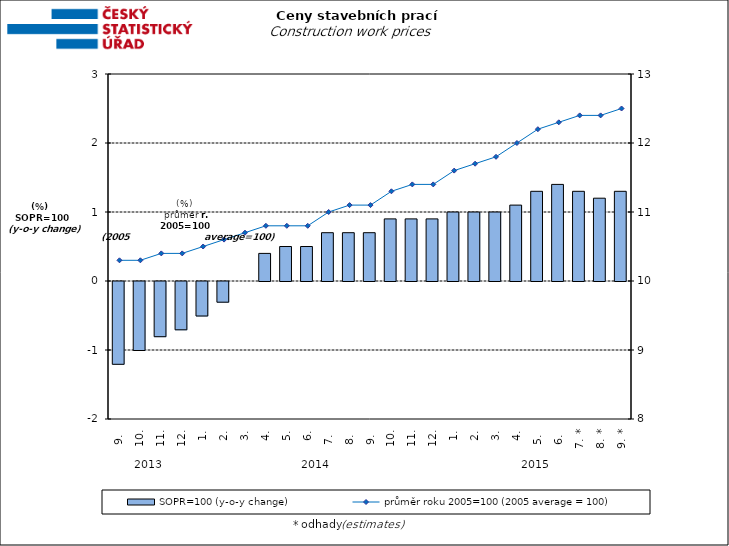
| Category | SOPR=100 (y-o-y change)   |
|---|---|
| 0 | -1.2 |
| 1 | -1 |
| 2 | -0.8 |
| 3 | -0.7 |
| 4 | -0.5 |
| 5 | -0.3 |
| 6 | 0 |
| 7 | 0.4 |
| 8 | 0.5 |
| 9 | 0.5 |
| 10 | 0.7 |
| 11 | 0.7 |
| 12 | 0.7 |
| 13 | 0.9 |
| 14 | 0.9 |
| 15 | 0.9 |
| 16 | 1 |
| 17 | 1 |
| 18 | 1 |
| 19 | 1.1 |
| 20 | 1.3 |
| 21 | 1.4 |
| 22 | 1.3 |
| 23 | 1.2 |
| 24 | 1.3 |